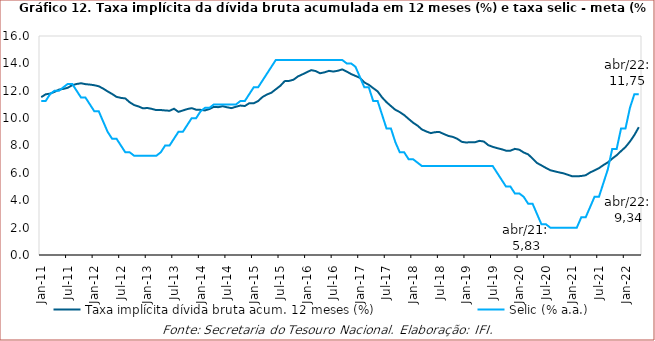
| Category | Taxa implícita dívida bruta acum. 12 meses (%) | Selic (% a.a.) |
|---|---|---|
| 2011-01-31 | 11.532 | 11.25 |
| 2011-02-28 | 11.738 | 11.25 |
| 2011-03-31 | 11.79 | 11.75 |
| 2011-04-30 | 11.919 | 12 |
| 2011-05-31 | 12.083 | 12 |
| 2011-06-30 | 12.135 | 12.25 |
| 2011-07-31 | 12.22 | 12.5 |
| 2011-08-31 | 12.405 | 12.5 |
| 2011-09-30 | 12.495 | 12 |
| 2011-10-31 | 12.546 | 11.5 |
| 2011-11-30 | 12.481 | 11.5 |
| 2011-12-31 | 12.452 | 11 |
| 2012-01-31 | 12.404 | 10.5 |
| 2012-02-29 | 12.328 | 10.5 |
| 2012-03-31 | 12.157 | 9.75 |
| 2012-04-30 | 11.953 | 9 |
| 2012-05-31 | 11.767 | 8.5 |
| 2012-06-30 | 11.556 | 8.5 |
| 2012-07-31 | 11.478 | 8 |
| 2012-08-31 | 11.438 | 7.5 |
| 2012-09-30 | 11.154 | 7.5 |
| 2012-10-31 | 10.955 | 7.25 |
| 2012-11-30 | 10.851 | 7.25 |
| 2012-12-31 | 10.714 | 7.25 |
| 2013-01-31 | 10.742 | 7.25 |
| 2013-02-28 | 10.675 | 7.25 |
| 2013-03-31 | 10.586 | 7.25 |
| 2013-04-30 | 10.592 | 7.5 |
| 2013-05-31 | 10.562 | 8 |
| 2013-06-30 | 10.538 | 8 |
| 2013-07-31 | 10.685 | 8.5 |
| 2013-08-31 | 10.458 | 9 |
| 2013-09-30 | 10.558 | 9 |
| 2013-10-31 | 10.662 | 9.5 |
| 2013-11-30 | 10.73 | 10 |
| 2013-12-31 | 10.616 | 10 |
| 2014-01-31 | 10.605 | 10.5 |
| 2014-02-28 | 10.563 | 10.75 |
| 2014-03-31 | 10.665 | 10.75 |
| 2014-04-30 | 10.821 | 11 |
| 2014-05-31 | 10.801 | 11 |
| 2014-06-30 | 10.87 | 11 |
| 2014-07-31 | 10.79 | 11 |
| 2014-08-31 | 10.731 | 11 |
| 2014-09-30 | 10.833 | 11 |
| 2014-10-31 | 10.919 | 11.25 |
| 2014-11-30 | 10.885 | 11.25 |
| 2014-12-31 | 11.088 | 11.75 |
| 2015-01-31 | 11.08 | 12.25 |
| 2015-02-27 | 11.249 | 12.25 |
| 2015-03-31 | 11.545 | 12.75 |
| 2015-04-30 | 11.725 | 13.25 |
| 2015-05-31 | 11.857 | 13.75 |
| 2015-06-30 | 12.11 | 14.25 |
| 2015-07-31 | 12.354 | 14.25 |
| 2015-08-31 | 12.702 | 14.25 |
| 2015-09-30 | 12.719 | 14.25 |
| 2015-10-31 | 12.808 | 14.25 |
| 2015-11-30 | 13.047 | 14.25 |
| 2015-12-31 | 13.196 | 14.25 |
| 2016-01-31 | 13.355 | 14.25 |
| 2016-02-29 | 13.506 | 14.25 |
| 2016-03-31 | 13.438 | 14.25 |
| 2016-04-30 | 13.28 | 14.25 |
| 2016-05-31 | 13.343 | 14.25 |
| 2016-06-30 | 13.455 | 14.25 |
| 2016-07-31 | 13.402 | 14.25 |
| 2016-08-31 | 13.46 | 14.25 |
| 2016-09-30 | 13.559 | 14.25 |
| 2016-10-31 | 13.404 | 14 |
| 2016-11-30 | 13.223 | 14 |
| 2016-12-31 | 13.083 | 13.75 |
| 2017-01-31 | 12.944 | 13 |
| 2017-02-28 | 12.606 | 12.25 |
| 2017-03-31 | 12.438 | 12.25 |
| 2017-04-30 | 12.191 | 11.25 |
| 2017-05-31 | 11.954 | 11.25 |
| 2017-06-30 | 11.515 | 10.25 |
| 2017-07-31 | 11.168 | 9.25 |
| 2017-08-31 | 10.883 | 9.25 |
| 2017-09-30 | 10.607 | 8.25 |
| 2017-10-31 | 10.442 | 7.5 |
| 2017-11-30 | 10.222 | 7.5 |
| 2017-12-31 | 9.942 | 7 |
| 2018-01-31 | 9.67 | 7 |
| 2018-02-28 | 9.455 | 6.75 |
| 2018-03-31 | 9.173 | 6.5 |
| 2018-04-30 | 9.025 | 6.5 |
| 2018-05-31 | 8.904 | 6.5 |
| 2018-06-30 | 8.976 | 6.5 |
| 2018-07-31 | 8.979 | 6.5 |
| 2018-08-31 | 8.834 | 6.5 |
| 2018-09-30 | 8.699 | 6.5 |
| 2018-10-31 | 8.626 | 6.5 |
| 2018-11-30 | 8.489 | 6.5 |
| 2018-12-31 | 8.268 | 6.5 |
| 2019-01-31 | 8.219 | 6.5 |
| 2019-02-28 | 8.243 | 6.5 |
| 2019-03-31 | 8.238 | 6.5 |
| 2019-04-30 | 8.341 | 6.5 |
| 2019-05-31 | 8.289 | 6.5 |
| 2019-06-30 | 8.026 | 6.5 |
| 2019-07-31 | 7.903 | 6.5 |
| 2019-08-31 | 7.807 | 6 |
| 2019-09-30 | 7.727 | 5.5 |
| 2019-10-31 | 7.623 | 5 |
| 2019-11-30 | 7.622 | 5 |
| 2019-12-31 | 7.755 | 4.5 |
| 2020-01-31 | 7.694 | 4.5 |
| 2020-02-29 | 7.49 | 4.25 |
| 2020-03-31 | 7.353 | 3.75 |
| 2020-04-30 | 7.05 | 3.75 |
| 2020-05-31 | 6.723 | 3 |
| 2020-06-30 | 6.548 | 2.25 |
| 2020-07-31 | 6.364 | 2.25 |
| 2020-08-31 | 6.195 | 2 |
| 2020-09-30 | 6.111 | 2 |
| 2020-10-31 | 6.036 | 2 |
| 2020-11-30 | 5.965 | 2 |
| 2020-12-31 | 5.859 | 2 |
| 2021-01-31 | 5.746 | 2 |
| 2021-02-28 | 5.746 | 2 |
| 2021-03-31 | 5.772 | 2.75 |
| 2021-04-30 | 5.825 | 2.75 |
| 2021-05-31 | 6.028 | 3.5 |
| 2021-06-30 | 6.184 | 4.25 |
| 2021-07-31 | 6.344 | 4.25 |
| 2021-08-31 | 6.568 | 5.25 |
| 2021-09-30 | 6.764 | 6.25 |
| 2021-10-31 | 7.041 | 7.75 |
| 2021-11-30 | 7.288 | 7.75 |
| 2021-12-31 | 7.595 | 9.25 |
| 2022-01-31 | 7.887 | 9.25 |
| 2022-02-28 | 8.286 | 10.75 |
| 2022-03-31 | 8.761 | 11.75 |
| 2022-04-30 | 9.338 | 11.75 |